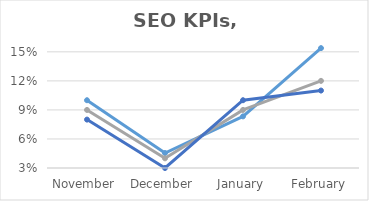
| Category | Visits | Orders | Revenue |
|---|---|---|---|
| November | 0.1 | 0.09 | 0.08 |
| December | 0.045 | 0.04 | 0.03 |
| January | 0.083 | 0.09 | 0.1 |
| February | 0.154 | 0.12 | 0.11 |